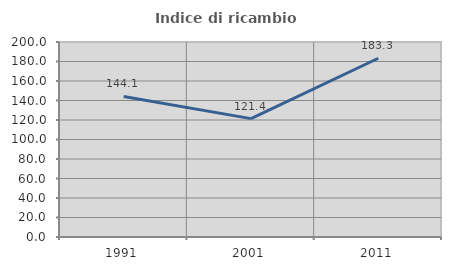
| Category | Indice di ricambio occupazionale  |
|---|---|
| 1991.0 | 144.118 |
| 2001.0 | 121.429 |
| 2011.0 | 183.333 |